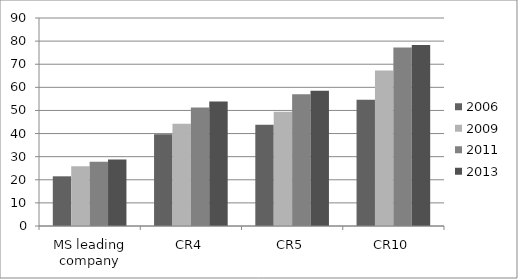
| Category | 2006 | 2009 | 2011 | 2013 |
|---|---|---|---|---|
| MS leading company | 21.5 | 25.8 | 27.8 | 28.8 |
| CR4 | 39.7 | 44.2 | 51.3 | 53.9 |
| CR5 | 43.8 | 49.4 | 57 | 58.5 |
| CR10 | 54.6 | 67.3 | 77.2 | 78.3 |